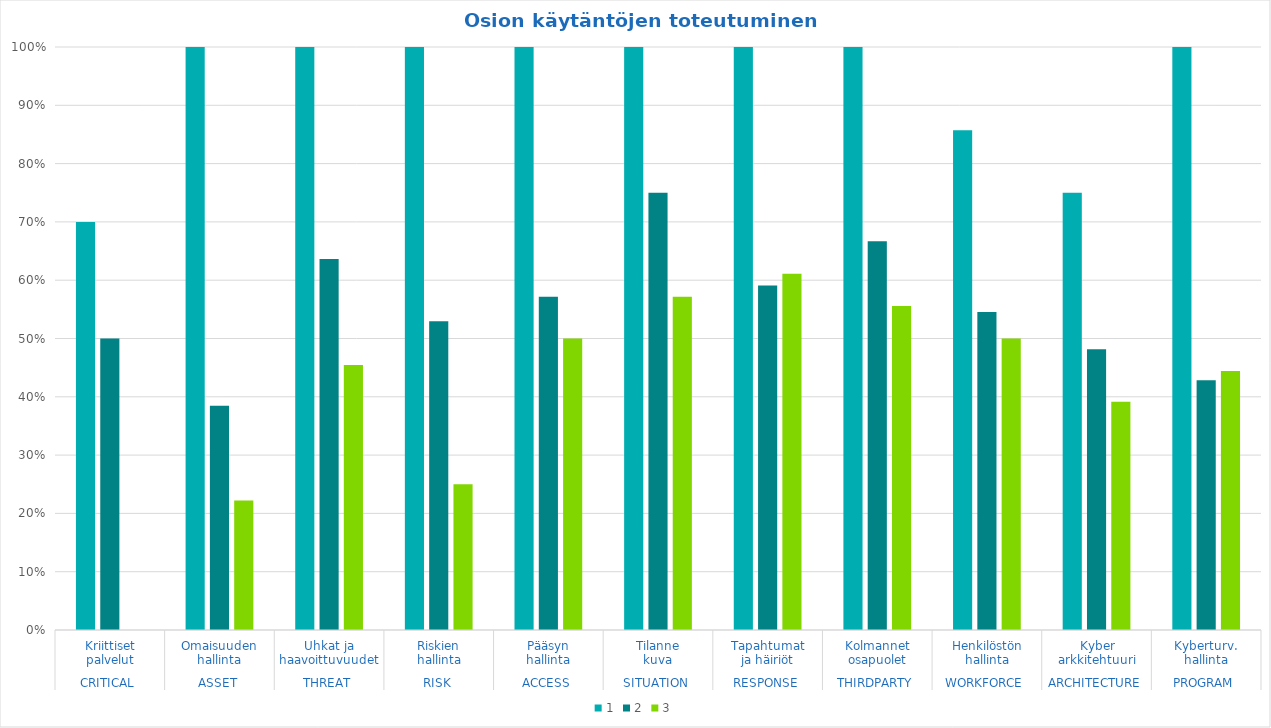
| Category | 1 | 2 | 3 |
|---|---|---|---|
| 0 | 0.7 | 0.5 | 0 |
| 1 | 1 | 0.385 | 0.222 |
| 2 | 1 | 0.636 | 0.455 |
| 3 | 1 | 0.529 | 0.25 |
| 4 | 1 | 0.571 | 0.5 |
| 5 | 1 | 0.75 | 0.571 |
| 6 | 1 | 0.591 | 0.611 |
| 7 | 1 | 0.667 | 0.556 |
| 8 | 0.857 | 0.545 | 0.5 |
| 9 | 0.75 | 0.481 | 0.391 |
| 10 | 1 | 0.429 | 0.444 |